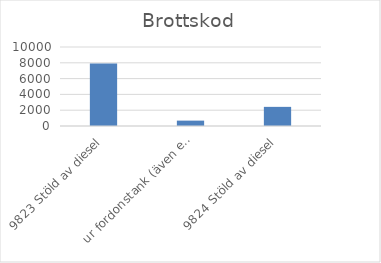
| Category | Summa |
|---|---|
| 9823 Stöld av diesel, ur fordonstank (även entreprenadmaskin m.m.) | 7909 |
| 9824 Stöld av diesel, ur större tankar (ej kopplade till fordon) | 681 |
| 9825 Stöld av drivmedel (även diesel), ej genom smitning | 2422 |